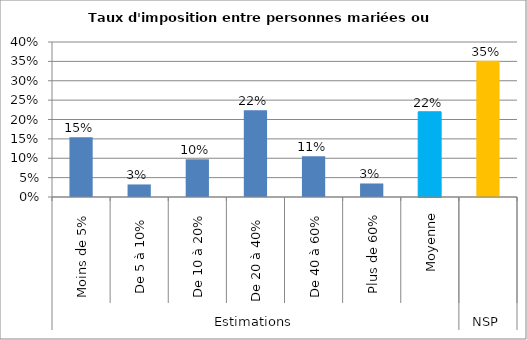
| Category | Taux d'imposition entre personnes mariées ou pacsées |
|---|---|
| 0 | 0.154 |
| 1 | 0.032 |
| 2 | 0.097 |
| 3 | 0.224 |
| 4 | 0.105 |
| 5 | 0.035 |
| 6 | 0.22 |
| 7 | 0.352 |